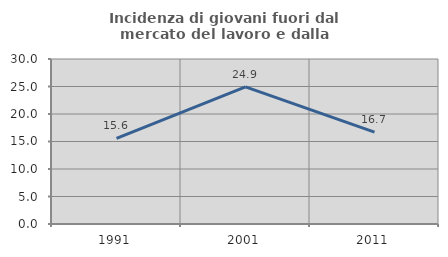
| Category | Incidenza di giovani fuori dal mercato del lavoro e dalla formazione  |
|---|---|
| 1991.0 | 15.584 |
| 2001.0 | 24.937 |
| 2011.0 | 16.716 |